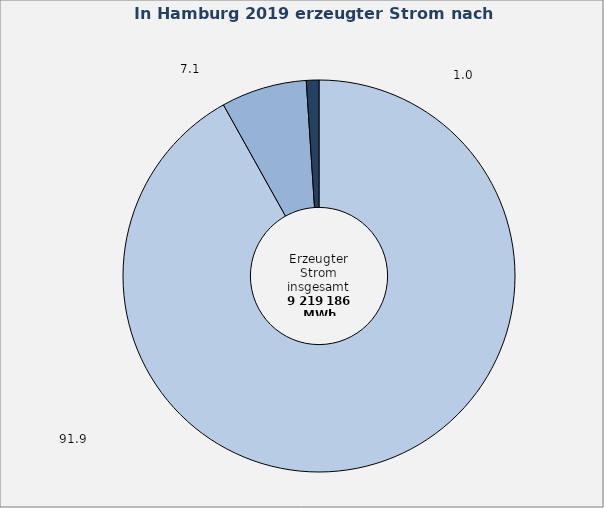
| Category | Anteil in Prozent |
|---|---|
| Fossile Energieträger | 91.895 |
| Erneuerbare Energien | 7.068 |
| Abfälle und sonstige Energieträger | 1.037 |